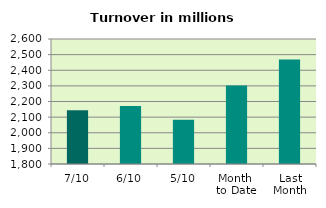
| Category | Series 0 |
|---|---|
| 7/10 | 2143.367 |
| 6/10 | 2170.853 |
| 5/10 | 2082.519 |
| Month 
to Date | 2302.524 |
| Last
Month | 2468.023 |